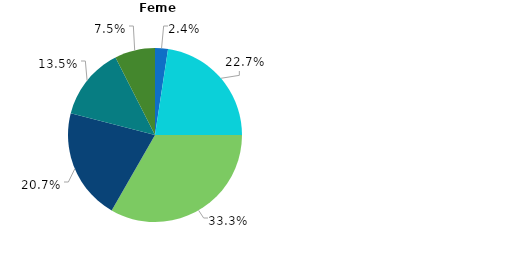
| Category | Series 0 |
|---|---|
| până la 20 ani | 2.4 |
| 20-29 ani | 22.6 |
| 30-39 ani | 33.3 |
| 40-49 ani | 20.7 |
| 50-59 ani | 13.5 |
| 60 și peste | 7.5 |